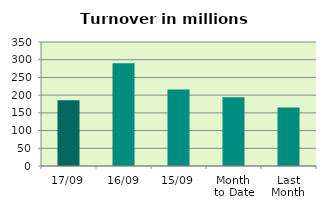
| Category | Series 0 |
|---|---|
| 17/09 | 185.737 |
| 16/09 | 290.021 |
| 15/09 | 216.027 |
| Month 
to Date | 193.769 |
| Last
Month | 165.075 |